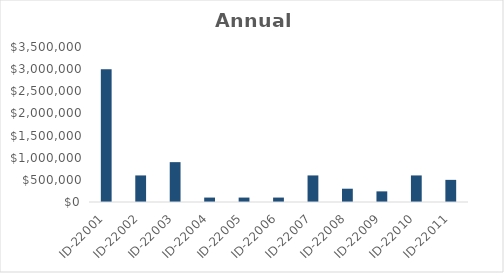
| Category | Annual Salary |
|---|---|
| ID-22001 | 3000000 |
| ID-22002 | 600000 |
| ID-22003 | 900000 |
| ID-22004 | 100000 |
| ID-22005 | 100000 |
| ID-22006 | 100000 |
| ID-22007 | 600000 |
| ID-22008 | 300000 |
| ID-22009 | 240000 |
| ID-22010 | 600000 |
| ID-22011 | 500000 |